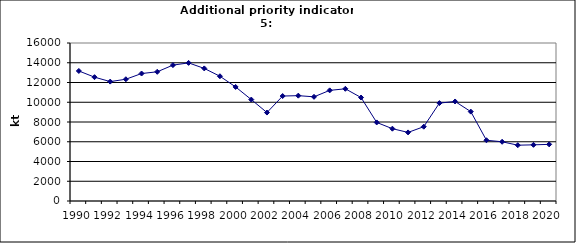
| Category | Production of oxygen steel, kt |
|---|---|
| 1990 | 13169 |
| 1991 | 12540 |
| 1992 | 12091 |
| 1993 | 12330 |
| 1994 | 12909 |
| 1995 | 13083 |
| 1996 | 13759 |
| 1997 | 13986.5 |
| 1998 | 13426 |
| 1999 | 12633.5 |
| 2000 | 11550.8 |
| 2001 | 10270.8 |
| 2002 | 8955.8 |
| 2003 | 10629.6 |
| 2004 | 10667.2 |
| 2005 | 10549.7 |
| 2006 | 11202.6 |
| 2007 | 11361.9 |
| 2008 | 10478 |
| 2009 | 7955 |
| 2010 | 7322.9 |
| 2011 | 6946.2 |
| 2012 | 7525.1 |
| 2013 | 9915.1 |
| 2014 | 10078.6 |
| 2015 | 9050.8 |
| 2016 | 6152.7 |
| 2017 | 5997.3 |
| 2018 | 5651.2 |
| 2019 | 5687.3 |
| 2020 | 5735 |